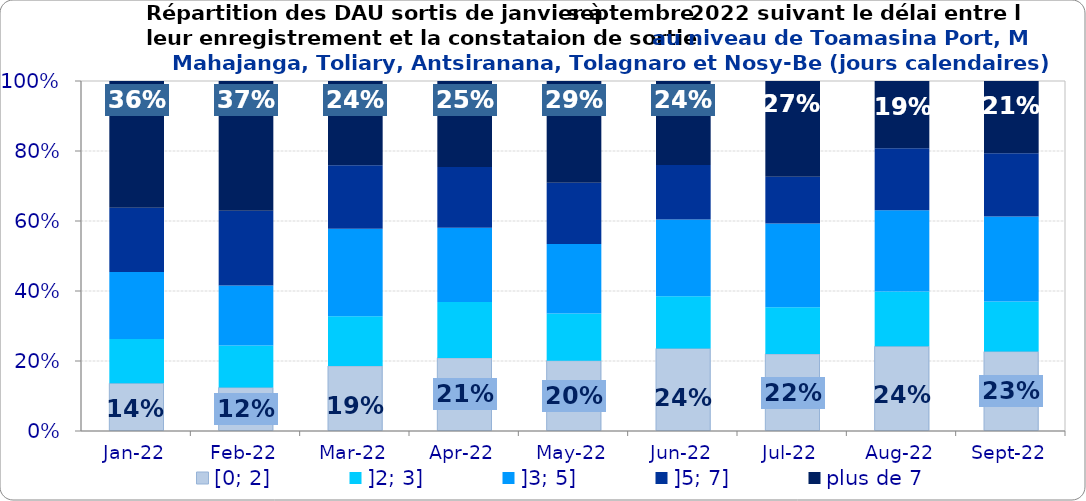
| Category | [0; 2] | ]2; 3] | ]3; 5] | ]5; 7] | plus de 7 |
|---|---|---|---|---|---|
| 2022-01-01 | 0.136 | 0.127 | 0.191 | 0.184 | 0.362 |
| 2022-02-01 | 0.124 | 0.12 | 0.172 | 0.213 | 0.371 |
| 2022-03-01 | 0.186 | 0.142 | 0.25 | 0.182 | 0.241 |
| 2022-04-01 | 0.209 | 0.16 | 0.212 | 0.173 | 0.246 |
| 2022-05-01 | 0.201 | 0.135 | 0.199 | 0.175 | 0.29 |
| 2022-06-01 | 0.236 | 0.149 | 0.219 | 0.156 | 0.24 |
| 2022-07-01 | 0.22 | 0.134 | 0.239 | 0.133 | 0.274 |
| 2022-08-01 | 0.242 | 0.157 | 0.232 | 0.177 | 0.192 |
| 2022-09-01 | 0.227 | 0.143 | 0.243 | 0.181 | 0.206 |